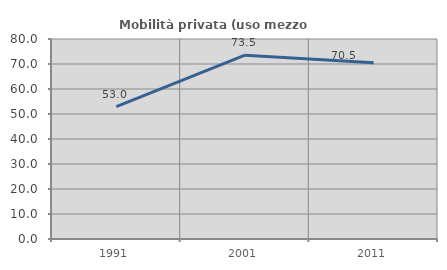
| Category | Mobilità privata (uso mezzo privato) |
|---|---|
| 1991.0 | 52.972 |
| 2001.0 | 73.523 |
| 2011.0 | 70.495 |